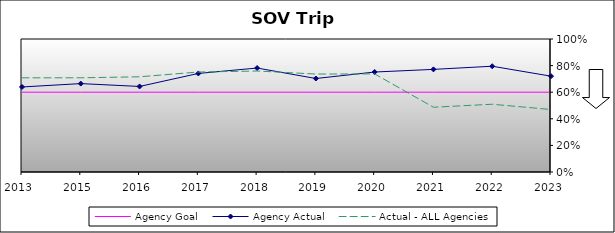
| Category | Agency Goal | Agency Actual | Actual - ALL Agencies |
|---|---|---|---|
| 2013.0 | 0.6 | 0.639 | 0.708 |
| 2015.0 | 0.6 | 0.665 | 0.708 |
| 2016.0 | 0.6 | 0.643 | 0.716 |
| 2017.0 | 0.6 | 0.741 | 0.752 |
| 2018.0 | 0.6 | 0.782 | 0.759 |
| 2019.0 | 0.6 | 0.703 | 0.736 |
| 2020.0 | 0.6 | 0.752 | 0.737 |
| 2021.0 | 0.6 | 0.772 | 0.487 |
| 2022.0 | 0.6 | 0.795 | 0.509 |
| 2023.0 | 0.6 | 0.72 | 0.47 |